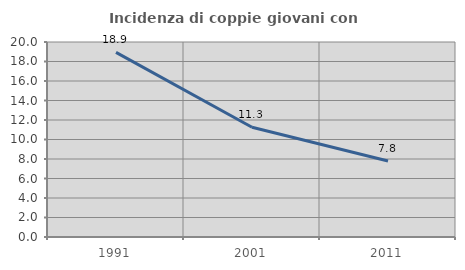
| Category | Incidenza di coppie giovani con figli |
|---|---|
| 1991.0 | 18.938 |
| 2001.0 | 11.258 |
| 2011.0 | 7.787 |